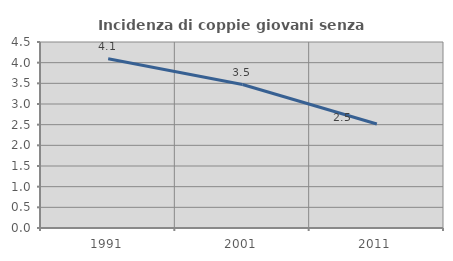
| Category | Incidenza di coppie giovani senza figli |
|---|---|
| 1991.0 | 4.094 |
| 2001.0 | 3.471 |
| 2011.0 | 2.516 |